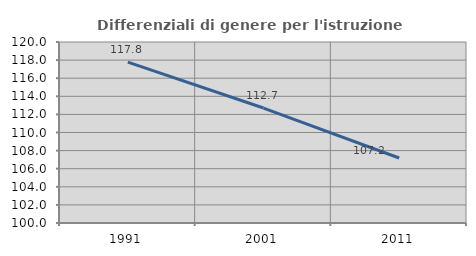
| Category | Differenziali di genere per l'istruzione superiore |
|---|---|
| 1991.0 | 117.776 |
| 2001.0 | 112.703 |
| 2011.0 | 107.184 |